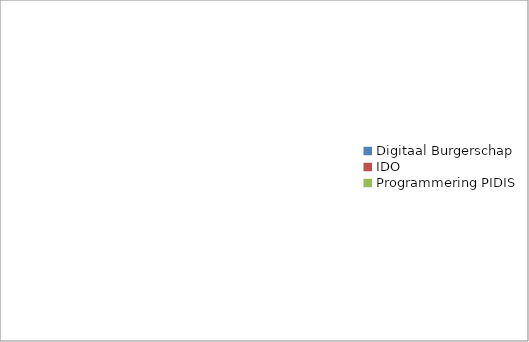
| Category | Series 0 |
|---|---|
| Digitaal Burgerschap | 0 |
| IDO | 0 |
| Programmering PIDIS | 0 |